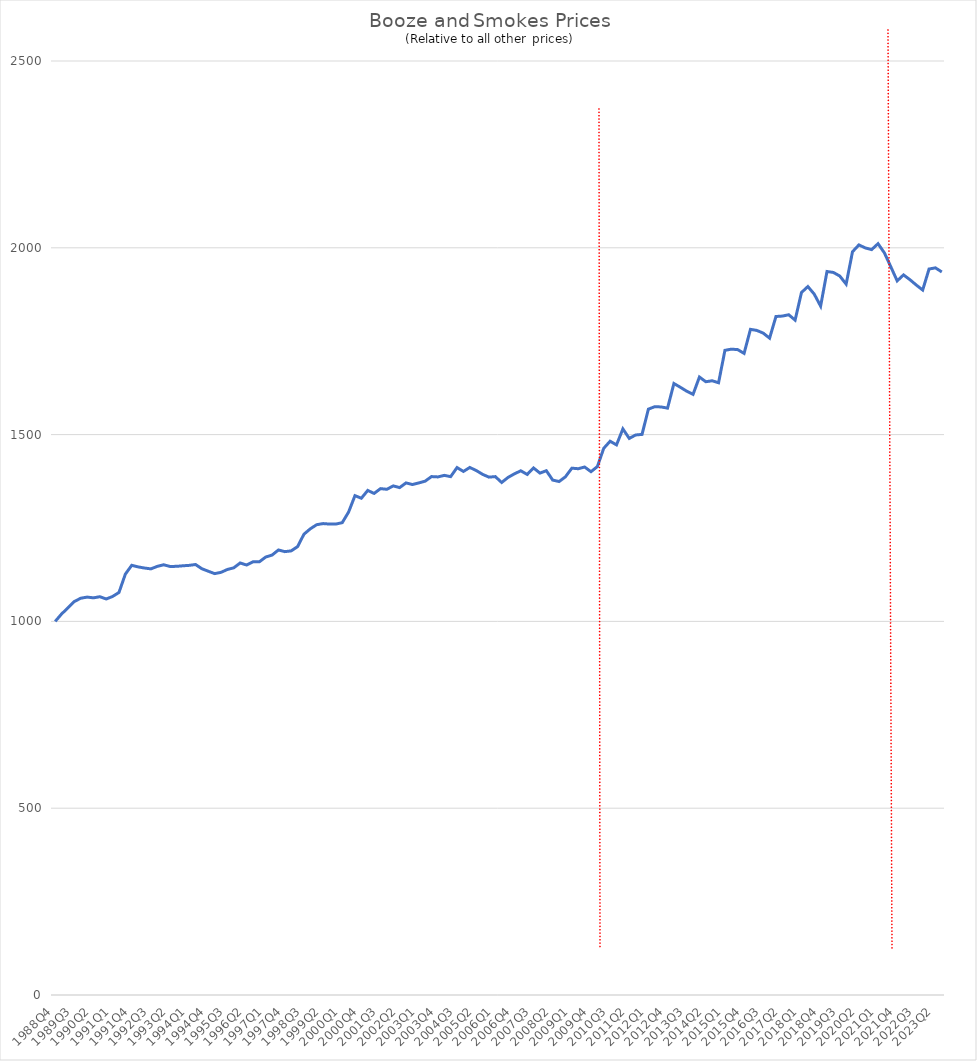
| Category | Series 0 |
|---|---|
| 1988Q4 | 1000 |
| 1989Q1 | 1019.822 |
| 1989Q2 | 1036.275 |
| 1989Q3 | 1053.181 |
| 1989Q4 | 1061.972 |
| 1990Q1 | 1065.056 |
| 1990Q2 | 1063.071 |
| 1990Q3 | 1066.063 |
| 1990Q4 | 1059.982 |
| 1991Q1 | 1066.726 |
| 1991Q2 | 1077.471 |
| 1991Q3 | 1126.56 |
| 1991Q4 | 1150.134 |
| 1992Q1 | 1145.907 |
| 1992Q2 | 1142.857 |
| 1992Q3 | 1140.584 |
| 1992Q4 | 1147.266 |
| 1993Q1 | 1151.542 |
| 1993Q2 | 1147.11 |
| 1993Q3 | 1147.341 |
| 1993Q4 | 1148.825 |
| 1994Q1 | 1149.974 |
| 1994Q2 | 1152.258 |
| 1994Q3 | 1140.91 |
| 1994Q4 | 1134.311 |
| 1995Q1 | 1127.877 |
| 1995Q2 | 1131.336 |
| 1995Q3 | 1139.006 |
| 1995Q4 | 1143.396 |
| 1996Q1 | 1156.397 |
| 1996Q2 | 1150.97 |
| 1996Q3 | 1159.492 |
| 1996Q4 | 1159.423 |
| 1997Q1 | 1172.227 |
| 1997Q2 | 1177.519 |
| 1997Q3 | 1191.178 |
| 1997Q4 | 1186.733 |
| 1998Q1 | 1188.766 |
| 1998Q2 | 1200.14 |
| 1998Q3 | 1233.42 |
| 1998Q4 | 1247.898 |
| 1999Q1 | 1258.841 |
| 1999Q2 | 1261.807 |
| 1999Q3 | 1260.55 |
| 1999Q4 | 1260.553 |
| 2000Q1 | 1264.301 |
| 2000Q2 | 1292.794 |
| 2000Q3 | 1336.608 |
| 2000Q4 | 1329.685 |
| 2001Q1 | 1350.547 |
| 2001Q2 | 1342.553 |
| 2001Q3 | 1355.363 |
| 2001Q4 | 1353.64 |
| 2002Q1 | 1362.704 |
| 2002Q2 | 1358.146 |
| 2002Q3 | 1370.664 |
| 2002Q4 | 1366.377 |
| 2003Q1 | 1370.623 |
| 2003Q2 | 1375.358 |
| 2003Q3 | 1387.641 |
| 2003Q4 | 1386.727 |
| 2004Q1 | 1390.842 |
| 2004Q2 | 1387.535 |
| 2004Q3 | 1411.78 |
| 2004Q4 | 1401.387 |
| 2005Q1 | 1412.022 |
| 2005Q2 | 1403.967 |
| 2005Q3 | 1393.654 |
| 2005Q4 | 1386.15 |
| 2006Q1 | 1387.558 |
| 2006Q2 | 1371.805 |
| 2006Q3 | 1385.441 |
| 2006Q4 | 1395.033 |
| 2007Q1 | 1403.106 |
| 2007Q2 | 1393.366 |
| 2007Q3 | 1410.693 |
| 2007Q4 | 1396.964 |
| 2008Q1 | 1403.371 |
| 2008Q2 | 1378.276 |
| 2008Q3 | 1374.353 |
| 2008Q4 | 1387.176 |
| 2009Q1 | 1410.159 |
| 2009Q2 | 1408.675 |
| 2009Q3 | 1413.261 |
| 2009Q4 | 1400.725 |
| 2010Q1 | 1414.439 |
| 2010Q2 | 1463.342 |
| 2010Q3 | 1482.294 |
| 2010Q4 | 1472.477 |
| 2011Q1 | 1515.254 |
| 2011Q2 | 1489.797 |
| 2011Q3 | 1499 |
| 2011Q4 | 1500.524 |
| 2012Q1 | 1568.117 |
| 2012Q2 | 1574.728 |
| 2012Q3 | 1574.028 |
| 2012Q4 | 1570.824 |
| 2013Q1 | 1636.706 |
| 2013Q2 | 1626.805 |
| 2013Q3 | 1616.227 |
| 2013Q4 | 1607.639 |
| 2014Q1 | 1654.098 |
| 2014Q2 | 1641.516 |
| 2014Q3 | 1644.081 |
| 2014Q4 | 1638.739 |
| 2015Q1 | 1725.556 |
| 2015Q2 | 1728.707 |
| 2015Q3 | 1727.501 |
| 2015Q4 | 1717.374 |
| 2016Q1 | 1781.716 |
| 2016Q2 | 1778.824 |
| 2016Q3 | 1771.674 |
| 2016Q4 | 1758.164 |
| 2017Q1 | 1816.128 |
| 2017Q2 | 1817.271 |
| 2017Q3 | 1820.739 |
| 2017Q4 | 1806.443 |
| 2018Q1 | 1880.308 |
| 2018Q2 | 1896.282 |
| 2018Q3 | 1876.007 |
| 2018Q4 | 1843.891 |
| 2019Q1 | 1936.523 |
| 2019Q2 | 1934.057 |
| 2019Q3 | 1924.479 |
| 2019Q4 | 1902.81 |
| 2020Q1 | 1989.433 |
| 2020Q2 | 2007.735 |
| 2020Q3 | 1999.693 |
| 2020Q4 | 1995.197 |
| 2021Q1 | 2010.999 |
| 2021Q2 | 1986.319 |
| 2021Q3 | 1949.436 |
| 2021Q4 | 1911.548 |
| 2022Q1 | 1927.457 |
| 2022Q2 | 1914.653 |
| 2022Q3 | 1900.293 |
| 2022Q4 | 1886.991 |
| 2023Q1 | 1943.22 |
| 2023Q2 | 1946.334 |
| 2023Q3 | 1935.313 |